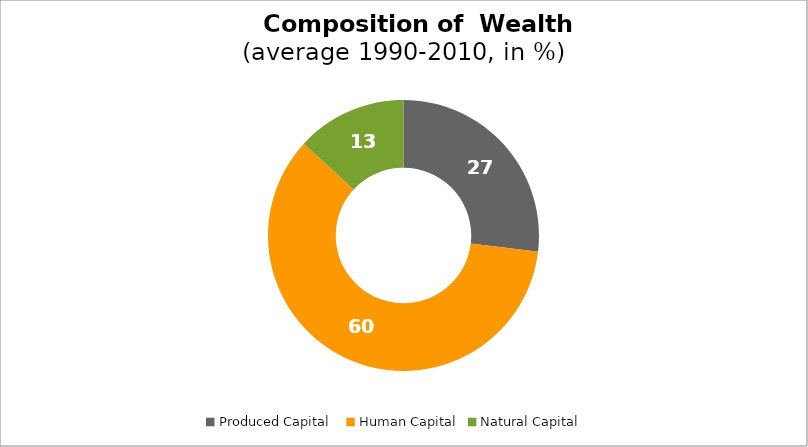
| Category | Series 0 |
|---|---|
| Produced Capital  | 26.901 |
| Human Capital | 59.957 |
| Natural Capital | 13.142 |